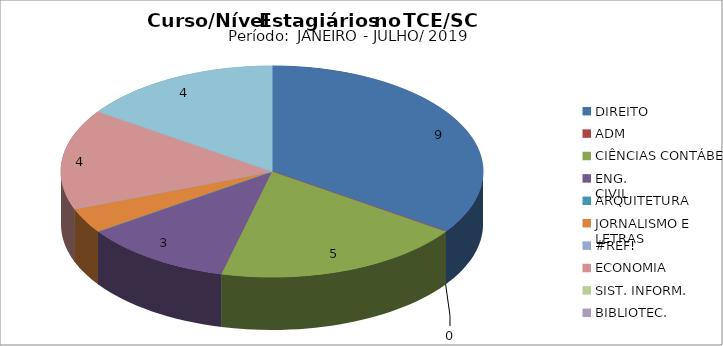
| Category | Series 0 |
|---|---|
| DIREITO | 9 |
| ADM | 0 |
| CIÊNCIAS CONTÁBEIS | 5 |
| ENG.
CIVIL | 3 |
| ARQUITETURA | 0 |
| JORNALISMO E LETRAS
 | 1 |
| #REF! | 0 |
| ECONOMIA | 4 |
| SIST. INFORM. | 0 |
| BIBLIOTEC. | 0 |
| NÍVEL
MÉDIO  | 4 |